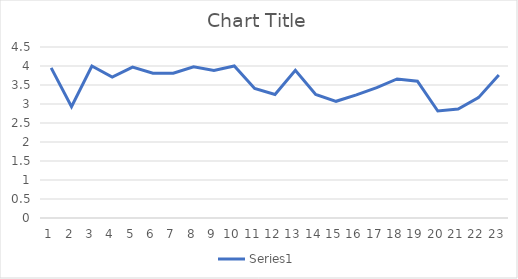
| Category | Series 0 |
|---|---|
| 0 | 3.95 |
| 1 | 2.93 |
| 2 | 4 |
| 3 | 3.708 |
| 4 | 3.97 |
| 5 | 3.81 |
| 6 | 3.81 |
| 7 | 3.98 |
| 8 | 3.88 |
| 9 | 4 |
| 10 | 3.41 |
| 11 | 3.25 |
| 12 | 3.886 |
| 13 | 3.25 |
| 14 | 3.071 |
| 15 | 3.24 |
| 16 | 3.432 |
| 17 | 3.66 |
| 18 | 3.6 |
| 19 | 2.816 |
| 20 | 2.867 |
| 21 | 3.167 |
| 22 | 3.762 |